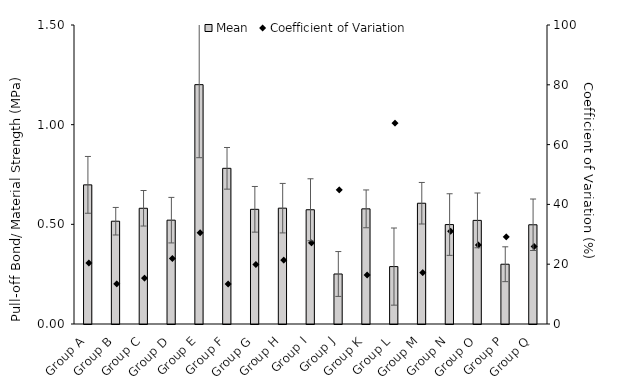
| Category | Mean |
|---|---|
| Group A | 0.698 |
| Group B | 0.516 |
| Group C | 0.581 |
| Group D | 0.521 |
| Group E | 1.201 |
| Group F | 0.781 |
| Group G | 0.575 |
| Group H | 0.581 |
| Group I | 0.573 |
| Group J | 0.251 |
| Group K | 0.578 |
| Group L | 0.288 |
| Group M | 0.606 |
| Group N | 0.499 |
| Group O | 0.52 |
| Group P | 0.3 |
| Group Q | 0.498 |